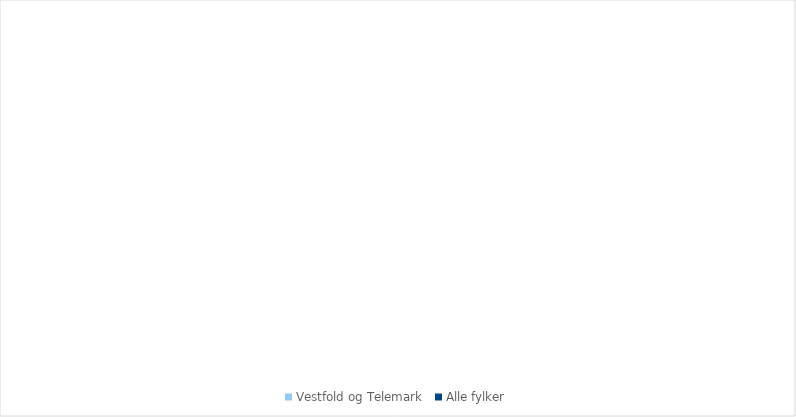
| Category | Vestfold og Telemark | Alle fylker |
|---|---|---|
| 1.1 Landbruk | 0.752 | 0.814 |
| 1.2 Fiske/oppdrett | 0 | 1.732 |
| 2.1 Primærforedlingsindustri | 2.23 | 2.443 |
| 2.2 Olje/gass, bergverk | 0.368 | 2.052 |
| 2.3 Teknologiindustri | 2.887 | 1.926 |
| 2.4 Annen industri | 8.564 | 3.764 |
| 3.1 Bygg/anlegg, energi, vann/
avløp, eiendom | 24.088 | 21.135 |
| 3.2 Transport- og distribusjonstjenester | 3.815 | 4.233 |
| 4.1 Kunnskapsintensiv forretningsmessig tjenesteyting (KIFT) | 9.87 | 16.953 |
| 4.2 Varehandel | 11.096 | 9.688 |
| 4.3 Overnatting og servering | 1.408 | 1.718 |
| 4.4 Annen privat dominert tjenesteyting | 4.689 | 5.772 |
| 5.1 Offentlig admistrasjon og forsvar | 7.209 | 8.035 |
| 5.2 Undervisning | 6.9 | 6.39 |
| 5.3 Helse- og omsorgstjenester | 16.123 | 13.343 |